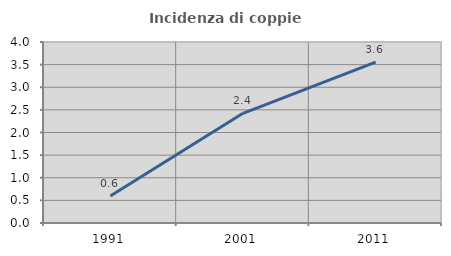
| Category | Incidenza di coppie miste |
|---|---|
| 1991.0 | 0.598 |
| 2001.0 | 2.424 |
| 2011.0 | 3.555 |